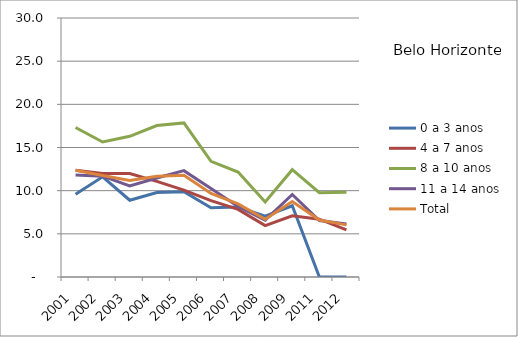
| Category | 0 a 3 anos | 4 a 7 anos | 8 a 10 anos | 11 a 14 anos | Total |
|---|---|---|---|---|---|
| 2001.0 | 9.59 | 12.37 | 17.32 | 11.81 | 12.36 |
| 2002.0 | 11.6 | 11.98 | 15.64 | 11.68 | 11.75 |
| 2003.0 | 8.89 | 11.98 | 16.3 | 10.55 | 11.17 |
| 2004.0 | 9.79 | 11.07 | 17.55 | 11.47 | 11.68 |
| 2005.0 | 9.88 | 10.07 | 17.85 | 12.32 | 11.79 |
| 2006.0 | 8.03 | 8.84 | 13.4 | 10.26 | 9.67 |
| 2007.0 | 8.11 | 7.83 | 12.16 | 8.16 | 8.47 |
| 2008.0 | 7.06 | 5.95 | 8.68 | 6.58 | 6.69 |
| 2009.0 | 8.25 | 7.08 | 12.43 | 9.56 | 8.75 |
| 2011.0 | 0 | 6.7 | 9.77 | 6.54 | 6.6 |
| 2012.0 | 0 | 5.45 | 9.82 | 6.13 | 6.04 |